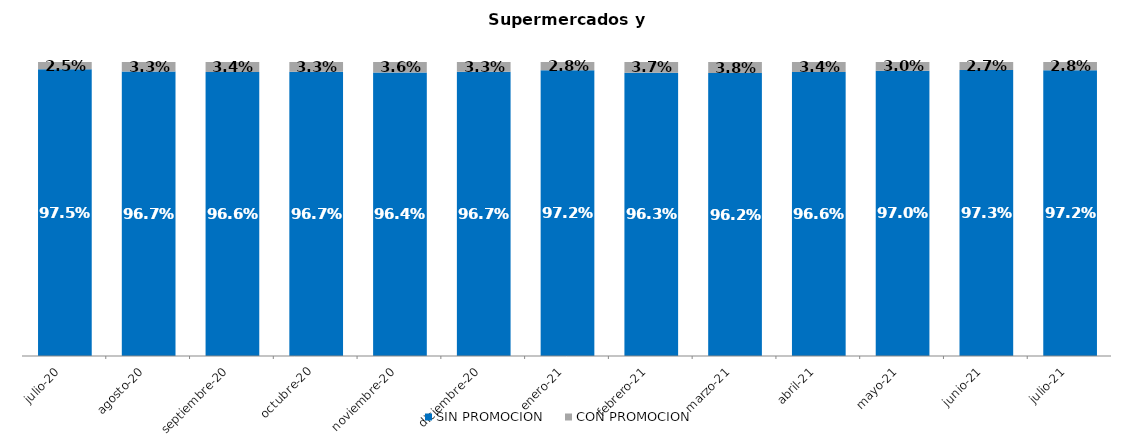
| Category | SIN PROMOCION   | CON PROMOCION   |
|---|---|---|
| 2020-07-01 | 0.975 | 0.025 |
| 2020-08-01 | 0.967 | 0.033 |
| 2020-09-01 | 0.966 | 0.034 |
| 2020-10-01 | 0.967 | 0.033 |
| 2020-11-01 | 0.964 | 0.036 |
| 2020-12-01 | 0.967 | 0.033 |
| 2021-01-01 | 0.972 | 0.028 |
| 2021-02-01 | 0.963 | 0.037 |
| 2021-03-01 | 0.962 | 0.038 |
| 2021-04-01 | 0.966 | 0.034 |
| 2021-05-01 | 0.97 | 0.03 |
| 2021-06-01 | 0.973 | 0.027 |
| 2021-07-01 | 0.972 | 0.028 |